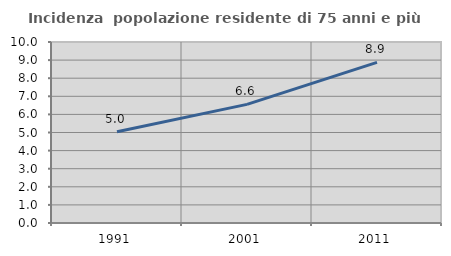
| Category | Incidenza  popolazione residente di 75 anni e più |
|---|---|
| 1991.0 | 5.037 |
| 2001.0 | 6.553 |
| 2011.0 | 8.874 |